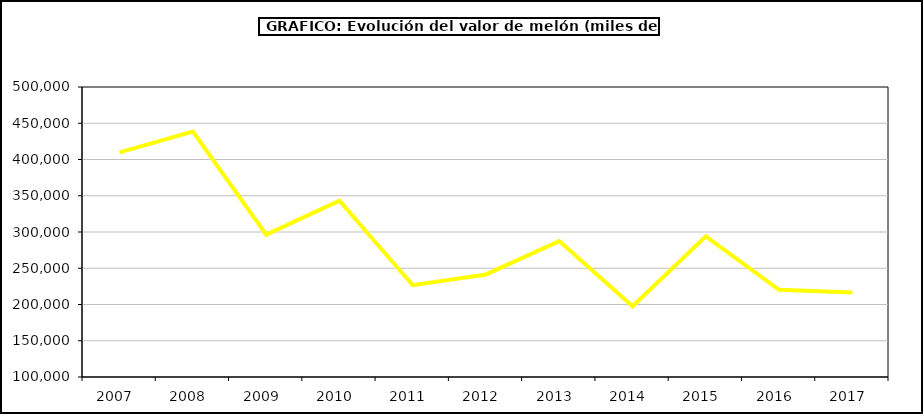
| Category | Valor |
|---|---|
| 2007.0 | 409844.546 |
| 2008.0 | 438449.843 |
| 2009.0 | 296322.107 |
| 2010.0 | 343061.749 |
| 2011.0 | 226631.76 |
| 2012.0 | 241464.672 |
| 2013.0 | 287421.365 |
| 2014.0 | 197555.814 |
| 2015.0 | 293985.4 |
| 2016.0 | 220336 |
| 2017.0 | 216504.545 |